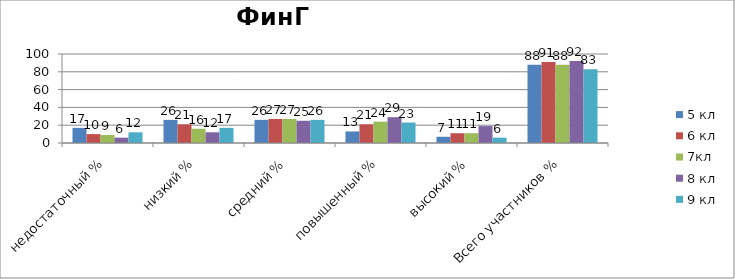
| Category | 5 кл | 6 кл | 7кл | 8 кл | 9 кл |
|---|---|---|---|---|---|
| недостаточный % | 17 | 10 | 9 | 6 | 12 |
| низкий % | 26 | 21 | 16 | 12 | 17 |
| средний % | 26 | 27 | 27 | 25 | 26 |
| повышенный % | 13 | 21 | 24 | 29 | 23 |
| высокий % | 7 | 11 | 11 | 19 | 6 |
| Всего участников % | 88 | 91 | 88 | 92 | 83 |